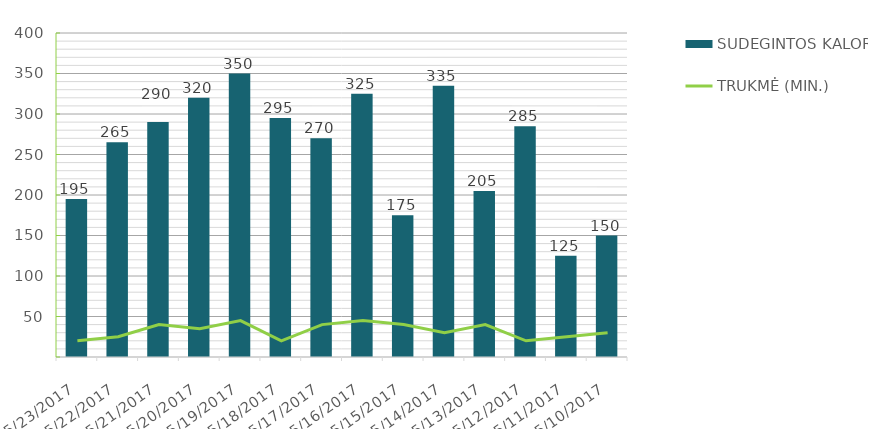
| Category | SUDEGINTOS KALORIJOS |
|---|---|
| 5/23/17 | 195 |
| 5/22/17 | 265 |
| 5/21/17 | 290 |
| 5/20/17 | 320 |
| 5/19/17 | 350 |
| 5/18/17 | 295 |
| 5/17/17 | 270 |
| 5/16/17 | 325 |
| 5/15/17 | 175 |
| 5/14/17 | 335 |
| 5/13/17 | 205 |
| 5/12/17 | 285 |
| 5/11/17 | 125 |
| 5/10/17 | 150 |